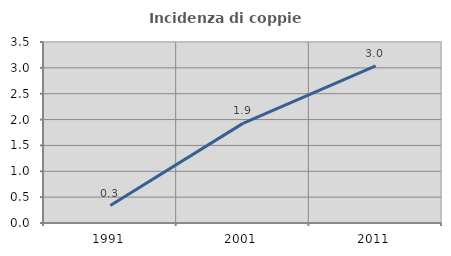
| Category | Incidenza di coppie miste |
|---|---|
| 1991.0 | 0.337 |
| 2001.0 | 1.927 |
| 2011.0 | 3.04 |